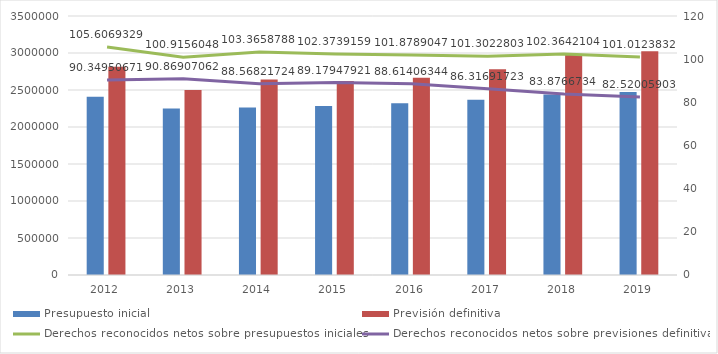
| Category | Presupuesto inicial | Previsión definitiva |
|---|---|---|
| 2012.0 | 2407218.064 | 2813727.777 |
| 2013.0 | 2251494.132 | 2500420.555 |
| 2014.0 | 2262738.711 | 2640789.018 |
| 2015.0 | 2283050.748 | 2620836.624 |
| 2016.0 | 2319746.35 | 2666994.471 |
| 2017.0 | 2369640.441 | 2781030.509 |
| 2018.0 | 2439137.654 | 2976756.109 |
| 2019.0 | 2471448.478 | 3025287.473 |